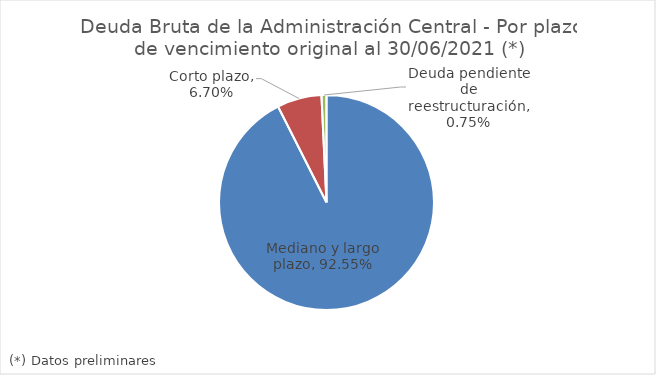
| Category | Series 0 |
|---|---|
| Mediano y largo plazo | 0.926 |
| Corto plazo | 0.067 |
| Deuda pendiente de reestructuración | 0.008 |